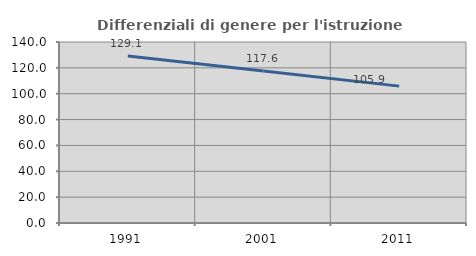
| Category | Differenziali di genere per l'istruzione superiore |
|---|---|
| 1991.0 | 129.14 |
| 2001.0 | 117.591 |
| 2011.0 | 105.874 |